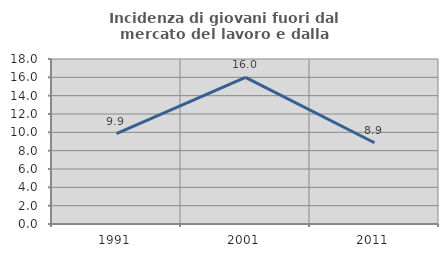
| Category | Incidenza di giovani fuori dal mercato del lavoro e dalla formazione  |
|---|---|
| 1991.0 | 9.852 |
| 2001.0 | 15.987 |
| 2011.0 | 8.861 |